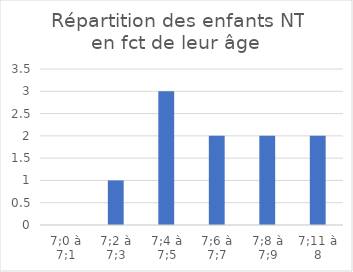
| Category | Series 0 |
|---|---|
| 7;0 à 7;1 | 0 |
| 7;2 à 7;3 | 1 |
| 7;4 à 7;5 | 3 |
| 7;6 à 7;7 | 2 |
| 7;8 à 7;9 | 2 |
| 7;11 à 8 | 2 |